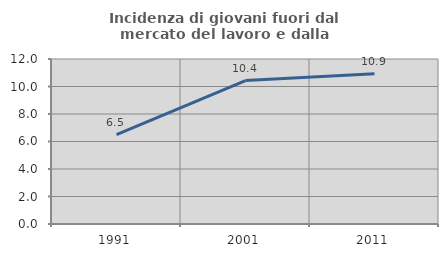
| Category | Incidenza di giovani fuori dal mercato del lavoro e dalla formazione  |
|---|---|
| 1991.0 | 6.499 |
| 2001.0 | 10.43 |
| 2011.0 | 10.924 |